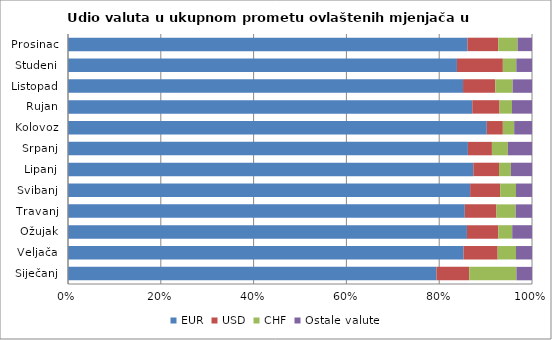
| Category | EUR | USD | CHF | Ostale valute |
|---|---|---|---|---|
| Siječanj | 0.794 | 0.071 | 0.102 | 0.034 |
| Veljača | 0.853 | 0.073 | 0.04 | 0.034 |
| Ožujak | 0.86 | 0.068 | 0.03 | 0.043 |
| Travanj | 0.855 | 0.068 | 0.042 | 0.035 |
| Svibanj | 0.867 | 0.065 | 0.034 | 0.034 |
| Lipanj | 0.874 | 0.055 | 0.026 | 0.045 |
| Srpanj | 0.862 | 0.052 | 0.034 | 0.052 |
| Kolovoz | 0.903 | 0.035 | 0.024 | 0.038 |
| Rujan | 0.871 | 0.059 | 0.027 | 0.043 |
| Listopad | 0.851 | 0.07 | 0.037 | 0.042 |
| Studeni | 0.838 | 0.099 | 0.029 | 0.034 |
| Prosinac | 0.861 | 0.066 | 0.042 | 0.031 |